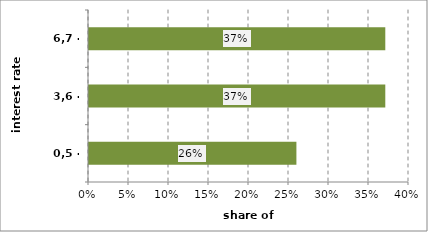
| Category | Series 0 |
|---|---|
| 0,5 - 3,6 | 0.259 |
| 3,6 - 6,7 | 0.37 |
| 6,7 - 9,8 | 0.37 |